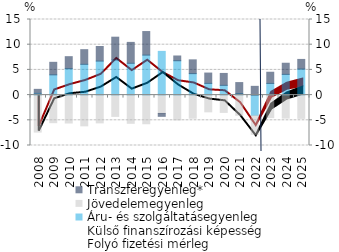
| Category | Áru- és szolgáltatásegyenleg | Jövedelemegyenleg | Transzferegyenleg* |
|---|---|---|---|
| 2008.0 | 0.347 | -7.341 | 0.795 |
| 2009.0 | 4.021 | -5.478 | 2.483 |
| 2010.0 | 5.256 | -5.542 | 2.369 |
| 2011.0 | 6.11 | -6.105 | 2.903 |
| 2012.0 | 6.752 | -5.517 | 2.896 |
| 2013.0 | 6.971 | -4.229 | 4.521 |
| 2014.0 | 6.316 | -5.598 | 4.145 |
| 2015.0 | 7.94 | -5.691 | 4.671 |
| 2016.0 | 8.675 | -3.642 | -0.569 |
| 2017.0 | 6.819 | -4.916 | 0.941 |
| 2018.0 | 4.262 | -4.583 | 2.731 |
| 2019.0 | 2.325 | -3.325 | 2.048 |
| 2020.0 | 1.936 | -3.434 | 2.364 |
| 2021.0 | 0.316 | -4.009 | 2.169 |
| 2022.0 | -4.021 | -3.759 | 1.737 |
| 2023.0 | 2.317 | -4.468 | 2.218 |
| 2024.0 | 4.113 | -4.565 | 2.209 |
| 2025.0 | 5.178 | -4.615 | 1.901 |